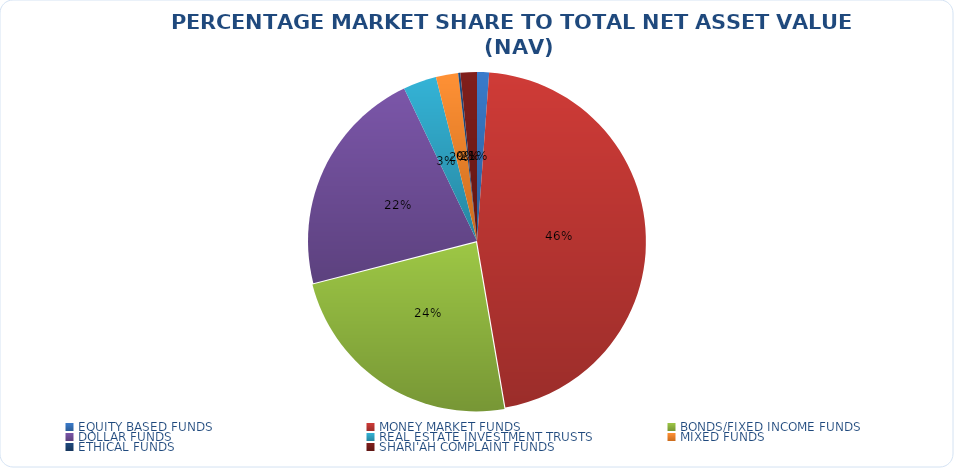
| Category | NET ASSET VALUE |
|---|---|
| EQUITY BASED FUNDS | 16651193594.34 |
| MONEY MARKET FUNDS | 668991989528.36 |
| BONDS/FIXED INCOME FUNDS | 343126814140.646 |
| DOLLAR FUNDS | 317633858239.457 |
| REAL ESTATE INVESTMENT TRUSTS | 46235461396.51 |
| MIXED FUNDS | 30761564463.892 |
| ETHICAL FUNDS | 3037541892 |
| SHARI'AH COMPLAINT FUNDS | 22775267421.45 |